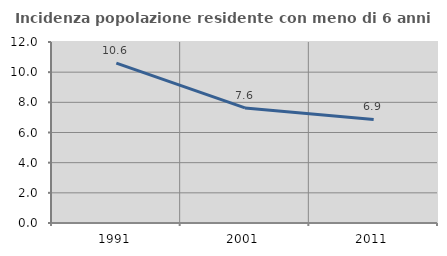
| Category | Incidenza popolazione residente con meno di 6 anni |
|---|---|
| 1991.0 | 10.602 |
| 2001.0 | 7.629 |
| 2011.0 | 6.867 |